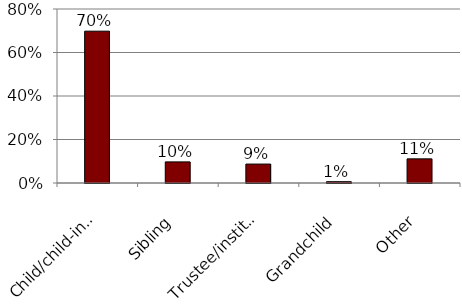
| Category | Series 0 |
|---|---|
| Child/child-in-law | 0.698 |
| Sibling | 0.097 |
| Trustee/institution | 0.087 |
| Grandchild | 0.006 |
| Other | 0.111 |